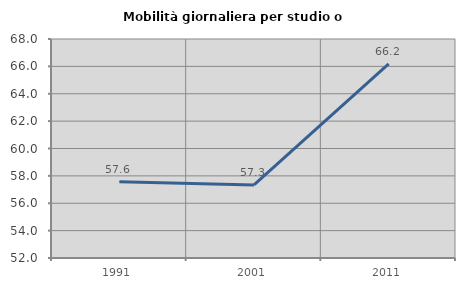
| Category | Mobilità giornaliera per studio o lavoro |
|---|---|
| 1991.0 | 57.567 |
| 2001.0 | 57.337 |
| 2011.0 | 66.177 |